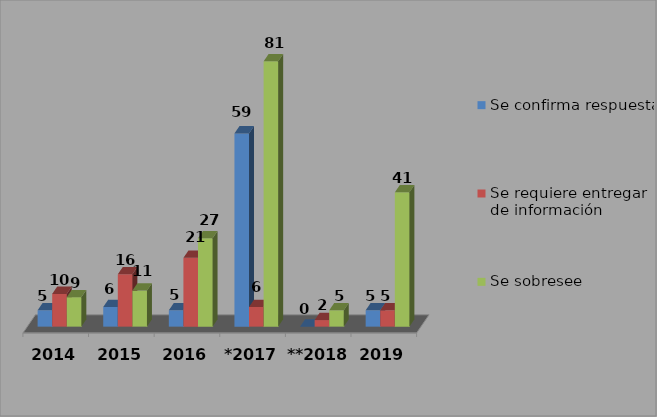
| Category | Se confirma respuesta | Se requiere entregar de información  | Se sobresee  |
|---|---|---|---|
| 2014 | 5 | 10 | 9 |
| 2015 | 6 | 16 | 11 |
| 2016 | 5 | 21 | 27 |
| *2017 | 59 | 6 | 81 |
| **2018 | 0 | 2 | 5 |
| 2019 | 5 | 5 | 41 |